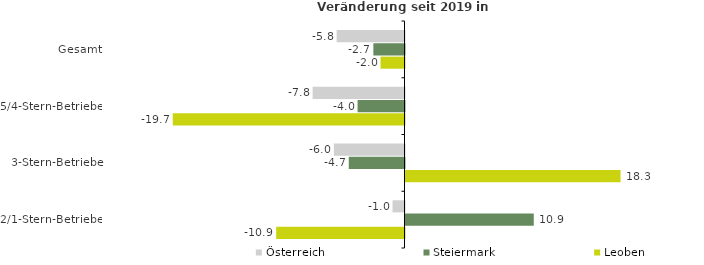
| Category | Österreich | Steiermark | Leoben |
|---|---|---|---|
| Gesamt | -5.779 | -2.653 | -2.042 |
| 5/4-Stern-Betriebe | -7.825 | -3.996 | -19.74 |
| 3-Stern-Betriebe | -6.014 | -4.748 | 18.318 |
| 2/1-Stern-Betriebe | -1.021 | 10.926 | -10.929 |